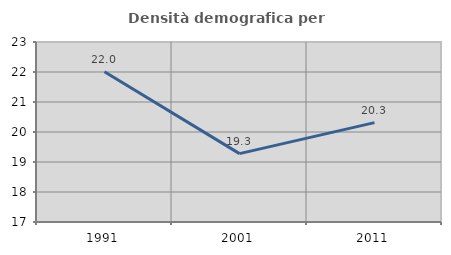
| Category | Densità demografica |
|---|---|
| 1991.0 | 22.011 |
| 2001.0 | 19.28 |
| 2011.0 | 20.312 |